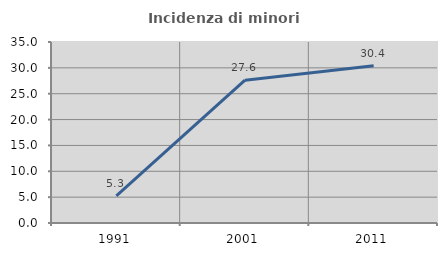
| Category | Incidenza di minori stranieri |
|---|---|
| 1991.0 | 5.263 |
| 2001.0 | 27.612 |
| 2011.0 | 30.398 |